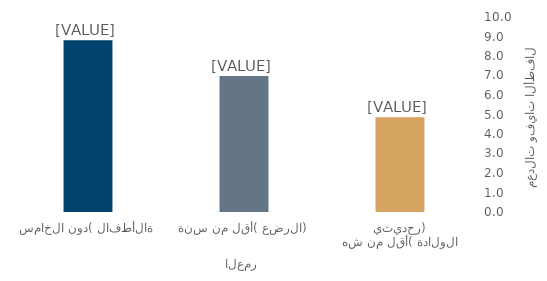
| Category | Series 0 |
|---|---|
| حديثي الولادة (أقل من شهر)  | 4.858 |
| الرضع (أقل من سنة) | 6.972 |
| الأطفال (دون الخامسة) | 8.809 |